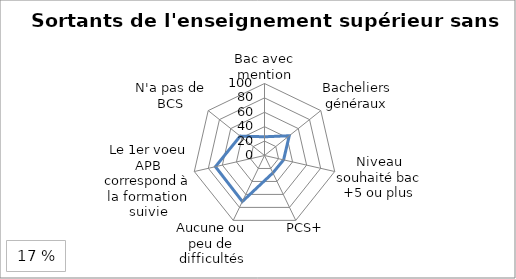
| Category | Sortants de l'enseignement supérieur sans diplôme |
|---|---|
| Bac avec mention | 26 |
| Bacheliers généraux | 44 |
| Niveau souhaité bac +5 ou plus | 27.2 |
| PCS+ | 26.8 |
| Aucune ou peu de difficultés | 70.9 |
| Le 1er voeu APB correspond à la formation suivie | 69.9 |
| N'a pas de BCS | 43.2 |